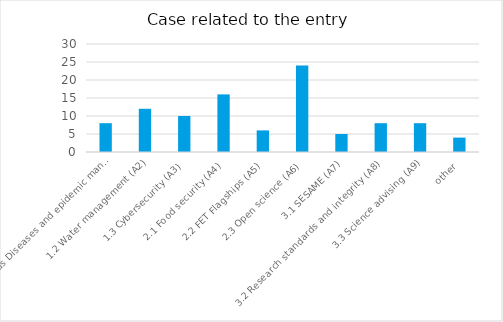
| Category | Case related to the entry |
|---|---|
| 1.1 Infectious Diseases and epidemic management (A1) | 8 |
| 1.2 Water management (A2) | 12 |
| 1.3 Cybersecurity (A3) | 10 |
| 2.1 Food security (A4) | 16 |
| 2.2 FET Flagships (A5) | 6 |
| 2.3 Open science (A6) | 24 |
| 3.1 SESAME (A7) | 5 |
| 3.2 Research standards and integrity (A8) | 8 |
| 3.3 Science advising (A9) | 8 |
| other | 4 |